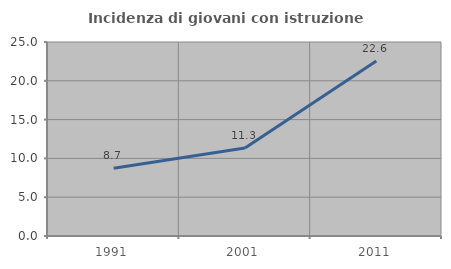
| Category | Incidenza di giovani con istruzione universitaria |
|---|---|
| 1991.0 | 8.719 |
| 2001.0 | 11.343 |
| 2011.0 | 22.564 |